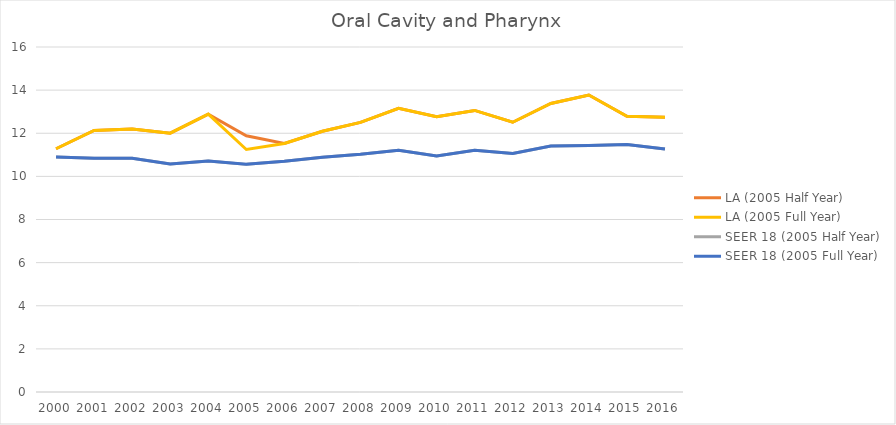
| Category | LA (2005 Half Year) | LA (2005 Full Year) | SEER 18 (2005 Half Year) | SEER 18 (2005 Full Year) |
|---|---|---|---|---|
| 2000.0 | 11.281 | 11.281 | 10.902 | 10.902 |
| 2001.0 | 12.128 | 12.128 | 10.839 | 10.839 |
| 2002.0 | 12.197 | 12.197 | 10.843 | 10.843 |
| 2003.0 | 12.005 | 12.005 | 10.578 | 10.578 |
| 2004.0 | 12.886 | 12.886 | 10.718 | 10.718 |
| 2005.0 | 11.883 | 11.247 | 10.557 | 10.558 |
| 2006.0 | 11.528 | 11.528 | 10.696 | 10.696 |
| 2007.0 | 12.095 | 12.095 | 10.89 | 10.89 |
| 2008.0 | 12.505 | 12.505 | 11.028 | 11.028 |
| 2009.0 | 13.156 | 13.156 | 11.214 | 11.214 |
| 2010.0 | 12.765 | 12.765 | 10.948 | 10.948 |
| 2011.0 | 13.058 | 13.058 | 11.206 | 11.206 |
| 2012.0 | 12.51 | 12.51 | 11.067 | 11.067 |
| 2013.0 | 13.383 | 13.383 | 11.412 | 11.412 |
| 2014.0 | 13.775 | 13.775 | 11.428 | 11.428 |
| 2015.0 | 12.783 | 12.783 | 11.476 | 11.476 |
| 2016.0 | 12.747 | 12.747 | 11.266 | 11.266 |